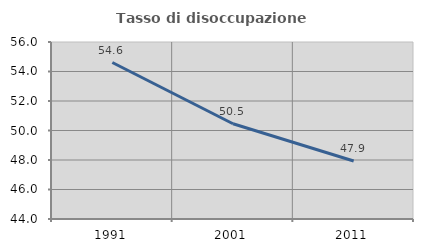
| Category | Tasso di disoccupazione giovanile  |
|---|---|
| 1991.0 | 54.61 |
| 2001.0 | 50.455 |
| 2011.0 | 47.936 |